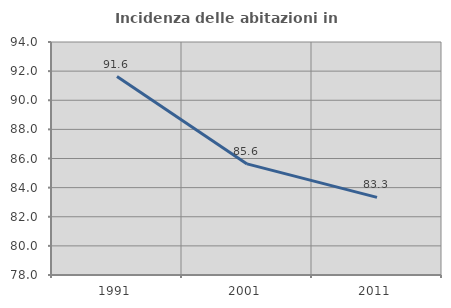
| Category | Incidenza delle abitazioni in proprietà  |
|---|---|
| 1991.0 | 91.629 |
| 2001.0 | 85.629 |
| 2011.0 | 83.333 |